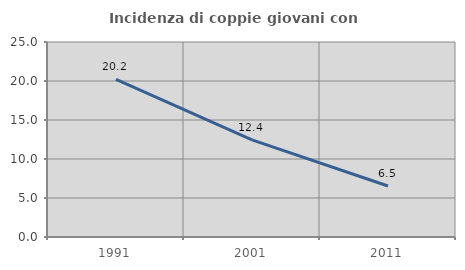
| Category | Incidenza di coppie giovani con figli |
|---|---|
| 1991.0 | 20.204 |
| 2001.0 | 12.445 |
| 2011.0 | 6.539 |